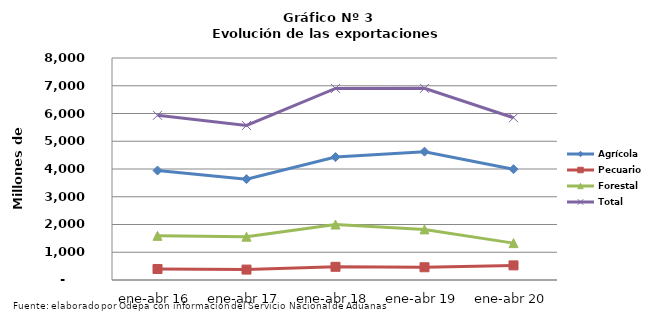
| Category | Agrícola | Pecuario | Forestal | Total |
|---|---|---|---|---|
| ene-abr 16 | 3945541 | 397399 | 1592049 | 5934989 |
| ene-abr 17 | 3635033 | 375185 | 1559907 | 5570125 |
| ene-abr 18 | 4429116 | 476014 | 1998600 | 6903730 |
| ene-abr 19 | 4623919 | 459339 | 1823266 | 6906524 |
| ene-abr 20 | 3992319 | 526962 | 1329198 | 5848479 |